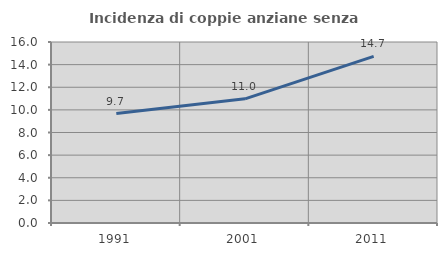
| Category | Incidenza di coppie anziane senza figli  |
|---|---|
| 1991.0 | 9.677 |
| 2001.0 | 10.975 |
| 2011.0 | 14.726 |